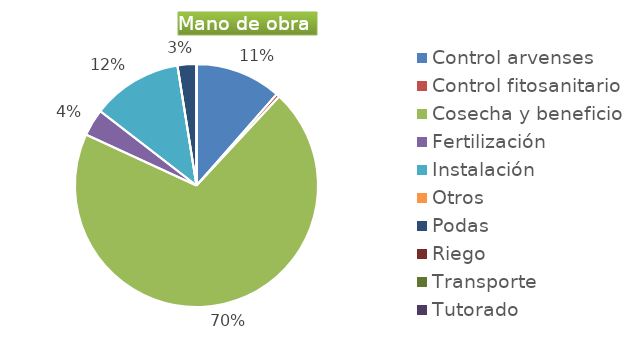
| Category | Series 0 |
|---|---|
| Control arvenses | 4915680 |
| Control fitosanitario | 187264 |
| Cosecha y beneficio | 29982603 |
| Fertilización | 1544928 |
| Instalación | 5149760 |
| Otros | 0 |
| Podas | 1076768 |
| Riego | 0 |
| Transporte | 0 |
| Tutorado | 0 |